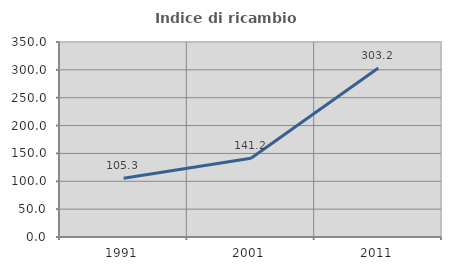
| Category | Indice di ricambio occupazionale  |
|---|---|
| 1991.0 | 105.317 |
| 2001.0 | 141.199 |
| 2011.0 | 303.181 |